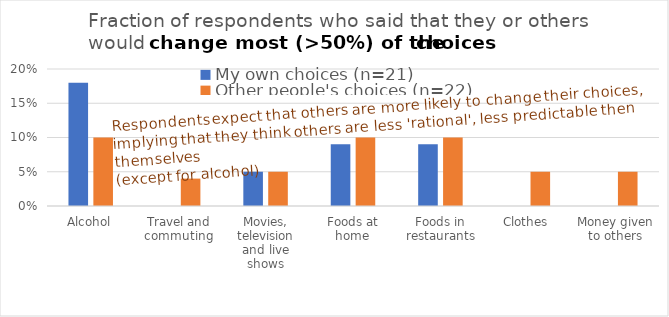
| Category | My own choices (n=21) | Other people's choices (n=22) |
|---|---|---|
| Alcohol | 0.18 | 0.1 |
| Travel and commuting | 0 | 0.04 |
| Movies, television and live shows | 0.05 | 0.05 |
| Foods at home | 0.09 | 0.1 |
| Foods in restaurants | 0.09 | 0.1 |
| Clothes | 0 | 0.05 |
| Money given to others | 0 | 0.05 |